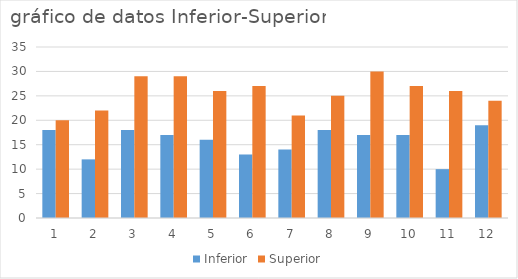
| Category | Inferior | Superior |
|---|---|---|
| 0 | 18 | 20 |
| 1 | 12 | 22 |
| 2 | 18 | 29 |
| 3 | 17 | 29 |
| 4 | 16 | 26 |
| 5 | 13 | 27 |
| 6 | 14 | 21 |
| 7 | 18 | 25 |
| 8 | 17 | 30 |
| 9 | 17 | 27 |
| 10 | 10 | 26 |
| 11 | 19 | 24 |